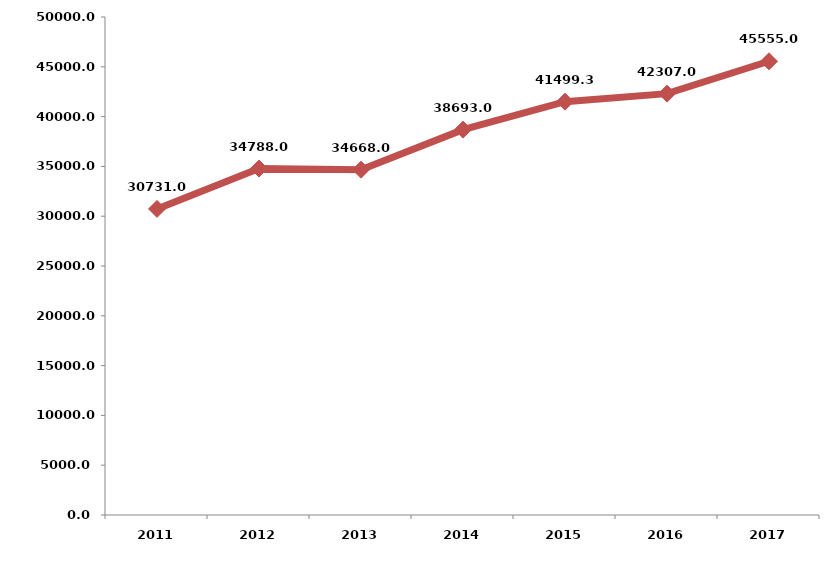
| Category | الطاقة المولــــدة
 [جبجا واط . ساعة) Generation (GWH) |
|---|---|
| 2011.0 | 30731 |
| 2012.0 | 34788 |
| 2013.0 | 34668 |
| 2014.0 | 38693 |
| 2015.0 | 41499.3 |
| 2016.0 | 42307 |
| 2017.0 | 45555 |